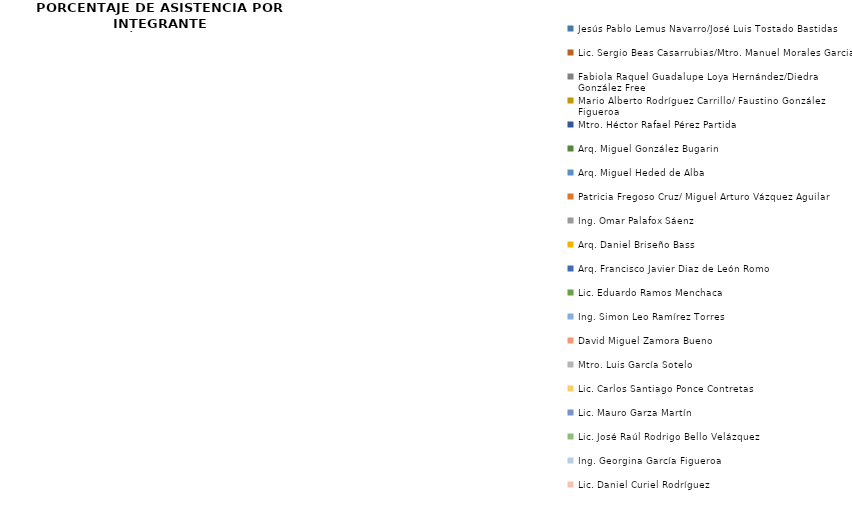
| Category | Series 0 |
|---|---|
| Jesús Pablo Lemus Navarro/José Luis Tostado Bastidas | 0 |
| Lic. Sergio Beas Casarrubias/Mtro. Manuel Morales Garcia | 0 |
| Fabiola Raquel Guadalupe Loya Hernández/Diedra González Free | 0 |
| Mario Alberto Rodríguez Carrillo/ Faustino González Figueroa | 0 |
| Mtro. Héctor Rafael Pérez Partida | 0 |
| Arq. Miguel González Bugarin | 0 |
| Arq. Miguel Heded de Alba | 0 |
| Patricia Fregoso Cruz/ Miguel Arturo Vázquez Aguilar | 0 |
| Ing. Omar Palafox Sáenz | 0 |
| Arq. Daniel Briseño Bass | 0 |
| Arq. Francisco Javier Diaz de León Romo | 0 |
| Lic. Eduardo Ramos Menchaca | 0 |
| Ing. Simon Leo Ramírez Torres | 0 |
| David Miguel Zamora Bueno | 0 |
| Mtro. Luis García Sotelo | 0 |
| Lic. Carlos Santiago Ponce Contretas | 0 |
| Lic. Mauro Garza Martín | 0 |
| Lic. José Raúl Rodrigo Bello Velázquez | 0 |
| Ing. Georgina García Figueroa | 0 |
| Lic. Daniel Curiel Rodríguez | 0 |